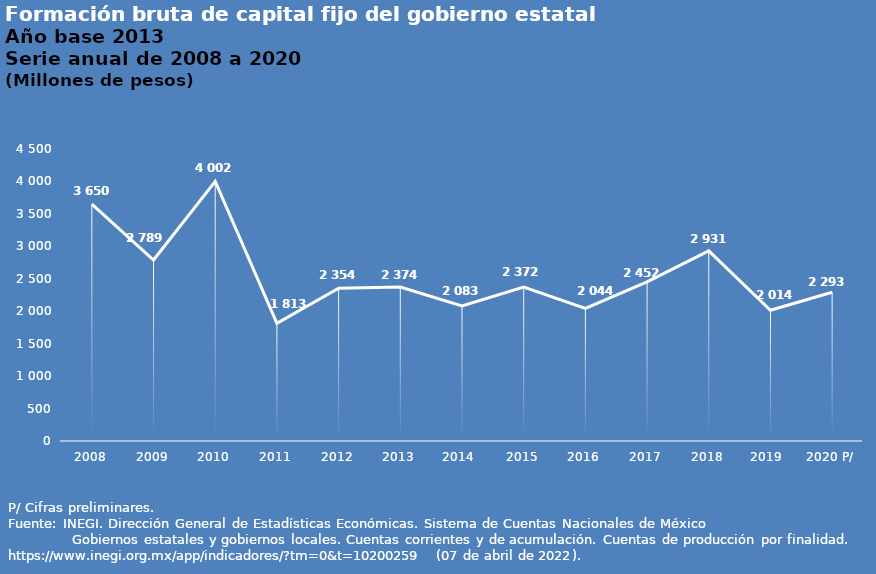
| Category | Series 0 |
|---|---|
| 2008 | 3650 |
| 2009 | 2789 |
| 2010 | 4002 |
| 2011 | 1813 |
| 2012 | 2354 |
| 2013 | 2374 |
| 2014  | 2083 |
| 2015 | 2372 |
| 2016 | 2044 |
| 2017 | 2452 |
| 2018 | 2931 |
| 2019  | 2014 |
| 2020 P/ | 2293 |